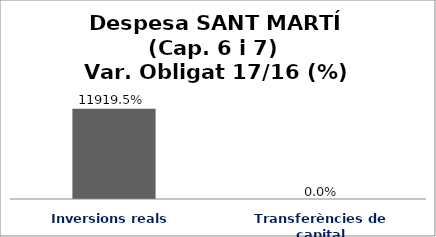
| Category | Series 0 |
|---|---|
| Inversions reals | 119.195 |
| Transferències de capital | 0 |